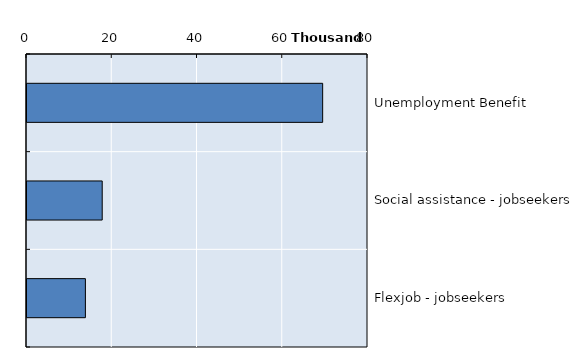
| Category | Series 0 |
|---|---|
| Unemployment Benefit | 69363.25 |
| Social assistance - jobseekers | 17645 |
| Flexjob - jobseekers | 13702.25 |